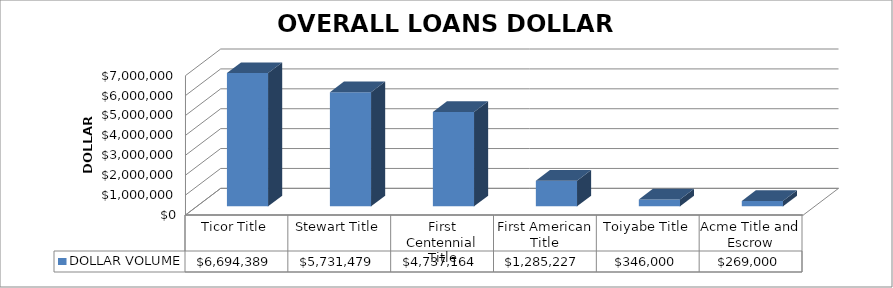
| Category | DOLLAR VOLUME |
|---|---|
| Ticor Title | 6694389 |
| Stewart Title | 5731479 |
| First Centennial Title | 4737164 |
| First American Title | 1285227 |
| Toiyabe Title | 346000 |
| Acme Title and Escrow | 269000 |